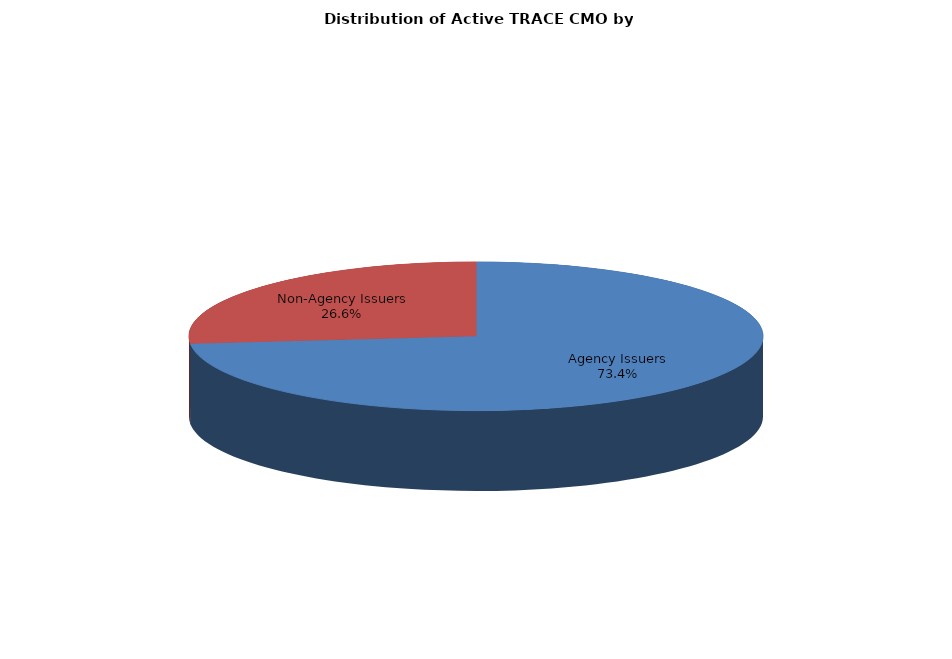
| Category | Series 0 |
|---|---|
| Agency Issuers | 167806 |
| Non-Agency Issuers | 60878 |